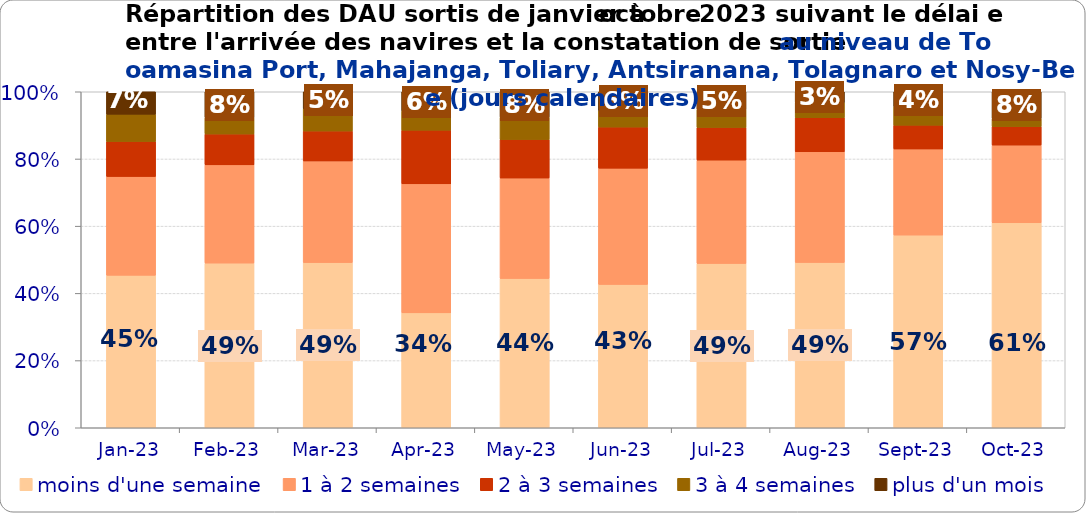
| Category | moins d'une semaine | 1 à 2 semaines | 2 à 3 semaines | 3 à 4 semaines | plus d'un mois |
|---|---|---|---|---|---|
| 2023-01-01 | 0.454 | 0.294 | 0.104 | 0.081 | 0.067 |
| 2023-02-01 | 0.49 | 0.292 | 0.092 | 0.048 | 0.078 |
| 2023-03-01 | 0.492 | 0.303 | 0.089 | 0.066 | 0.051 |
| 2023-04-01 | 0.342 | 0.384 | 0.16 | 0.057 | 0.057 |
| 2023-05-01 | 0.444 | 0.299 | 0.115 | 0.066 | 0.076 |
| 2023-06-01 | 0.427 | 0.346 | 0.122 | 0.049 | 0.056 |
| 2023-07-01 | 0.489 | 0.308 | 0.097 | 0.053 | 0.054 |
| 2023-08-01 | 0.492 | 0.33 | 0.101 | 0.045 | 0.032 |
| 2023-09-01 | 0.573 | 0.256 | 0.071 | 0.055 | 0.045 |
| 2023-10-01 | 0.61 | 0.231 | 0.055 | 0.024 | 0.08 |